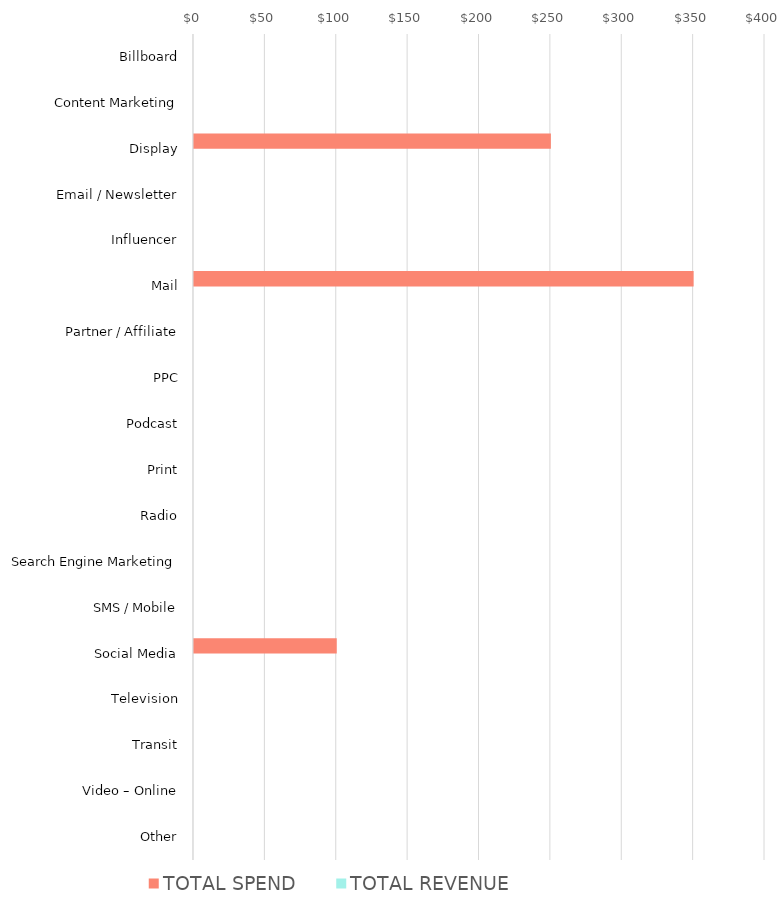
| Category | TOTAL SPEND | TOTAL REVENUE |
|---|---|---|
| Billboard | 0 | 0 |
| Content Marketing | 0 | 0 |
| Display | 250 | 0 |
| Email / Newsletter | 0 | 0 |
| Influencer | 0 | 0 |
| Mail | 350 | 0 |
| Partner / Affiliate | 0 | 0 |
| PPC | 0 | 0 |
| Podcast | 0 | 0 |
| Print | 0 | 0 |
| Radio | 0 | 0 |
| Search Engine Marketing | 0 | 0 |
| SMS / Mobile | 0 | 0 |
| Social Media | 100 | 0 |
| Television | 0 | 0 |
| Transit | 0 | 0 |
| Video – Online | 0 | 0 |
| Other | 0 | 0 |